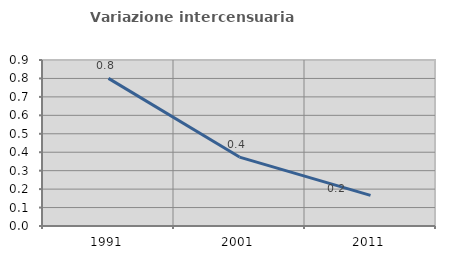
| Category | Variazione intercensuaria annua |
|---|---|
| 1991.0 | 0.8 |
| 2001.0 | 0.374 |
| 2011.0 | 0.166 |